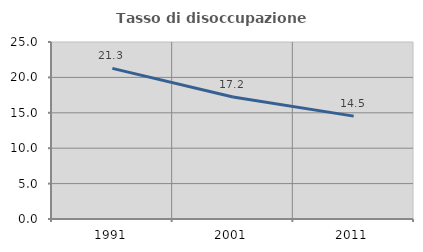
| Category | Tasso di disoccupazione giovanile  |
|---|---|
| 1991.0 | 21.277 |
| 2001.0 | 17.222 |
| 2011.0 | 14.53 |